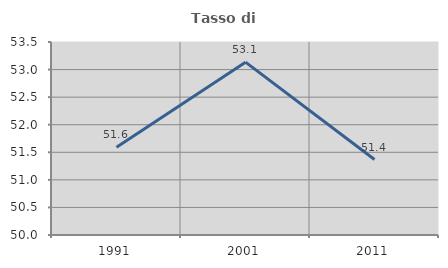
| Category | Tasso di occupazione   |
|---|---|
| 1991.0 | 51.591 |
| 2001.0 | 53.134 |
| 2011.0 | 51.369 |